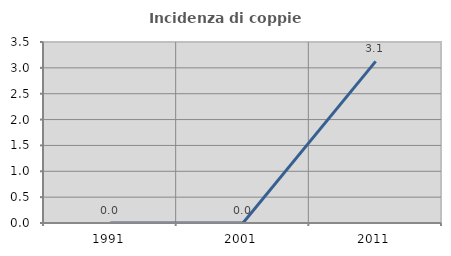
| Category | Incidenza di coppie miste |
|---|---|
| 1991.0 | 0 |
| 2001.0 | 0 |
| 2011.0 | 3.125 |